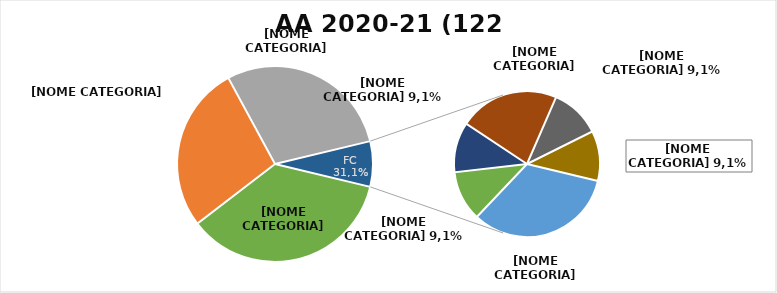
| Category | Series 0 |
|---|---|
| PRIMO ANNO | 43 |
| SECONDO ANNO | 33 |
| TERZO ANNO IC | 35 |
| FC 1 ANNO | 0 |
| FC 2 ANNI | 3 |
| FC 3 ANNI | 1 |
| FC 4 ANNI | 1 |
| FC 5 ANNI | 2 |
| FC 6 ANNI | 1 |
| FC 7 ANNI | 1 |